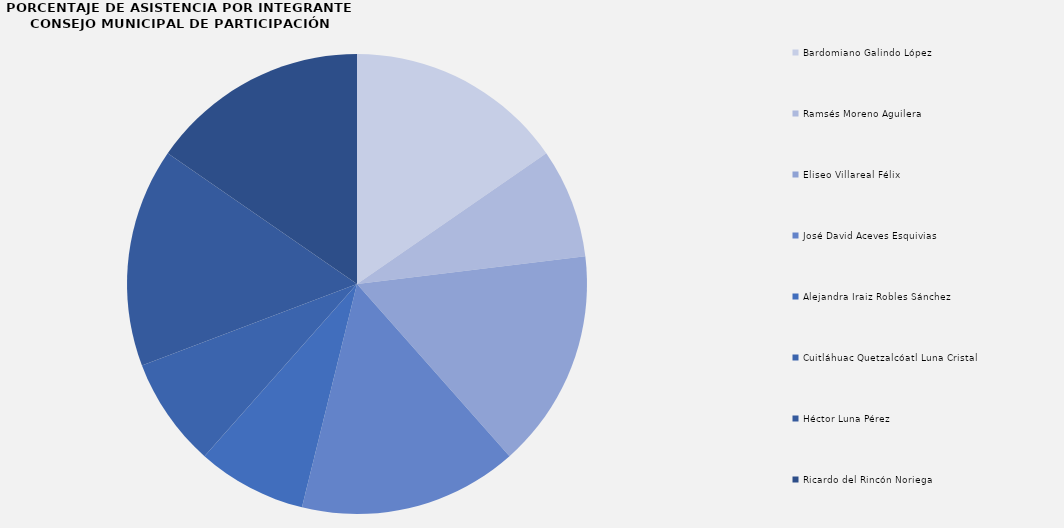
| Category | Series 0 |
|---|---|
| Bardomiano Galindo López | 2 |
| Ramsés Moreno Aguilera | 1 |
| Eliseo Villareal Félix | 2 |
| José David Aceves Esquivias | 2 |
| Alejandra Iraiz Robles Sánchez | 1 |
| Cuitláhuac Quetzalcóatl Luna Cristal | 1 |
| Héctor Luna Pérez | 2 |
| Ricardo del Rincón Noriega | 2 |